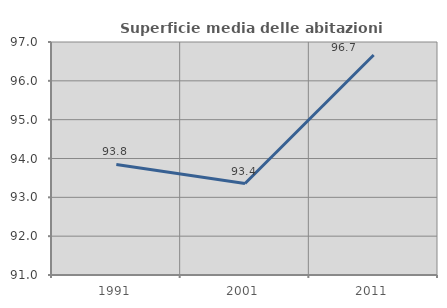
| Category | Superficie media delle abitazioni occupate |
|---|---|
| 1991.0 | 93.846 |
| 2001.0 | 93.356 |
| 2011.0 | 96.664 |